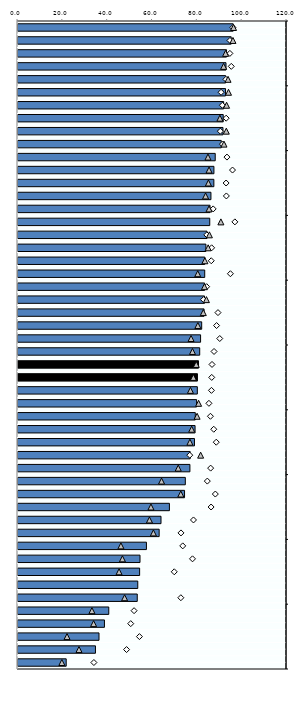
| Category | 25-64 |
|---|---|
| 0 | 95.994 |
| 1 | 95.096 |
| 2 | 93.031 |
| 3 | 92.781 |
| 4 | 92.629 |
| 5 | 92.583 |
| 6 | 91.74 |
| 7 | 91.55 |
| 8 | 91.437 |
| 9 | 90.663 |
| 10 | 87.979 |
| 11 | 87.406 |
| 12 | 87.373 |
| 13 | 86.074 |
| 14 | 85.667 |
| 15 | 85.542 |
| 16 | 84.311 |
| 17 | 83.82 |
| 18 | 83.335 |
| 19 | 83.3 |
| 20 | 83.265 |
| 21 | 83.2 |
| 22 | 83 |
| 23 | 81.945 |
| 24 | 81.453 |
| 25 | 81.061 |
| 26 | 80.532 |
| 27 | 80.048 |
| 28 | 80 |
| 29 | 79.686 |
| 30 | 79.091 |
| 31 | 78.988 |
| 32 | 78.726 |
| 33 | 76.8 |
| 34 | 76.693 |
| 35 | 74.639 |
| 36 | 74.296 |
| 37 | 67.547 |
| 38 | 63.796 |
| 39 | 62.974 |
| 40 | 57.295 |
| 41 | 54.426 |
| 42 | 54.257 |
| 43 | 53.428 |
| 44 | 53.2 |
| 45 | 40.496 |
| 46 | 38.565 |
| 47 | 36.135 |
| 48 | 34.557 |
| 49 | 21.505 |